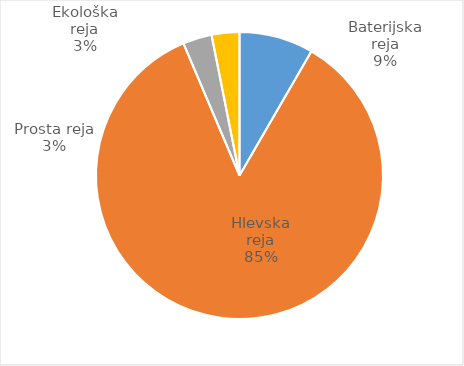
| Category | Število kosov jajc |
|---|---|
| Baterijska reja | 282508 |
| Hlevska reja | 2883847 |
| Prosta reja | 110313 |
| Ekološka reja | 105840 |